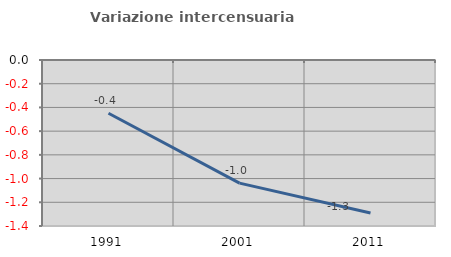
| Category | Variazione intercensuaria annua |
|---|---|
| 1991.0 | -0.449 |
| 2001.0 | -1.038 |
| 2011.0 | -1.29 |